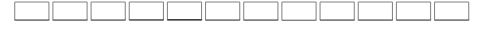
| Category | Dummy100Pct | Series 0 |
|---|---|---|
| 0 |  | 0.029 |
| 1 |  | 0.034 |
| 2 |  | 0.026 |
| 3 |  | 0.039 |
| 4 |  | 0.055 |
| 5 |  | 0.024 |
| 6 |  | 0.023 |
| 7 |  | 0.019 |
| 8 |  | 0.028 |
| 9 |  | 0.028 |
| 10 |  | 0.025 |
| 11 |  | 0.025 |